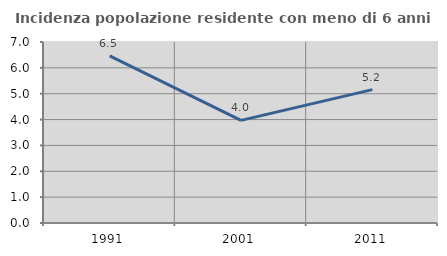
| Category | Incidenza popolazione residente con meno di 6 anni |
|---|---|
| 1991.0 | 6.466 |
| 2001.0 | 3.969 |
| 2011.0 | 5.159 |